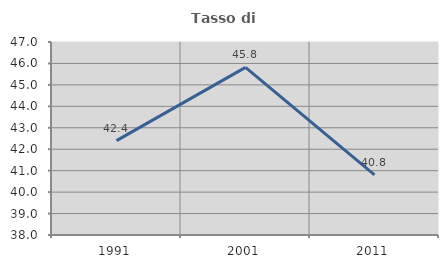
| Category | Tasso di occupazione   |
|---|---|
| 1991.0 | 42.403 |
| 2001.0 | 45.818 |
| 2011.0 | 40.8 |